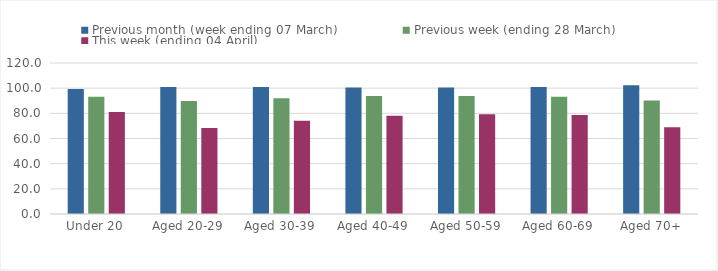
| Category | Previous month (week ending 07 March) | Previous week (ending 28 March) | This week (ending 04 April) |
|---|---|---|---|
| Under 20 | 99.289 | 93.133 | 81.158 |
| Aged 20-29 | 101.016 | 89.843 | 68.428 |
| Aged 30-39 | 100.984 | 91.997 | 74.165 |
| Aged 40-49 | 100.619 | 93.704 | 78.169 |
| Aged 50-59 | 100.565 | 93.842 | 79.233 |
| Aged 60-69 | 100.857 | 93.176 | 78.728 |
| Aged 70+ | 102.315 | 90.205 | 69.012 |